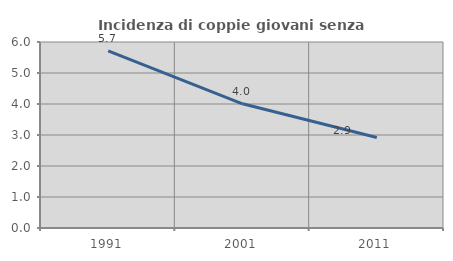
| Category | Incidenza di coppie giovani senza figli |
|---|---|
| 1991.0 | 5.712 |
| 2001.0 | 4.007 |
| 2011.0 | 2.922 |